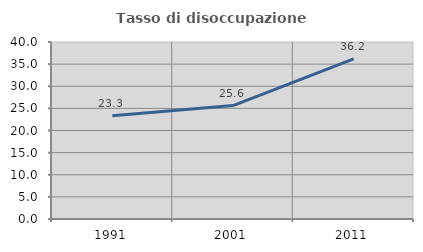
| Category | Tasso di disoccupazione giovanile  |
|---|---|
| 1991.0 | 23.333 |
| 2001.0 | 25.641 |
| 2011.0 | 36.17 |